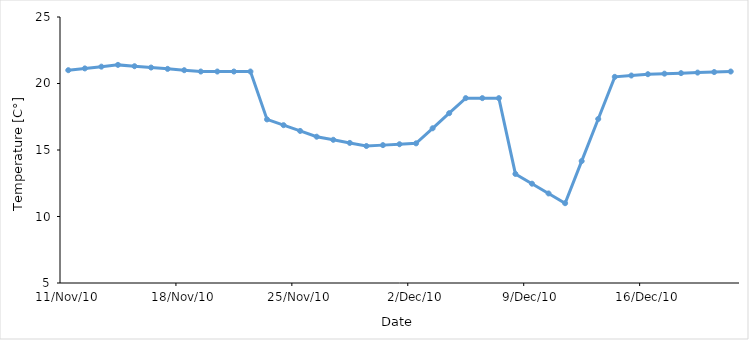
| Category | Series 0 |
|---|---|
| 2010-11-11 | 21 |
| 2010-11-12 | 21.133 |
| 2010-11-13 | 21.267 |
| 2010-11-14 | 21.4 |
| 2010-11-15 | 21.3 |
| 2010-11-16 | 21.2 |
| 2010-11-17 | 21.1 |
| 2010-11-18 | 21 |
| 2010-11-19 | 20.9 |
| 2010-11-20 | 20.9 |
| 2010-11-21 | 20.9 |
| 2010-11-22 | 20.9 |
| 2010-11-23 | 17.3 |
| 2010-11-24 | 16.867 |
| 2010-11-25 | 16.433 |
| 2010-11-26 | 16 |
| 2010-11-27 | 15.767 |
| 2010-11-28 | 15.533 |
| 2010-11-29 | 15.3 |
| 2010-11-30 | 15.367 |
| 2010-12-01 | 15.433 |
| 2010-12-02 | 15.5 |
| 2010-12-03 | 16.633 |
| 2010-12-04 | 17.767 |
| 2010-12-05 | 18.9 |
| 2010-12-06 | 18.9 |
| 2010-12-07 | 18.9 |
| 2010-12-08 | 13.2 |
| 2010-12-09 | 12.467 |
| 2010-12-10 | 11.733 |
| 2010-12-11 | 11 |
| 2010-12-12 | 14.167 |
| 2010-12-13 | 17.333 |
| 2010-12-14 | 20.5 |
| 2010-12-15 | 20.6 |
| 2010-12-16 | 20.7 |
| 2010-12-17 | 20.74 |
| 2010-12-18 | 20.78 |
| 2010-12-19 | 20.82 |
| 2010-12-20 | 20.86 |
| 2010-12-21 | 20.9 |